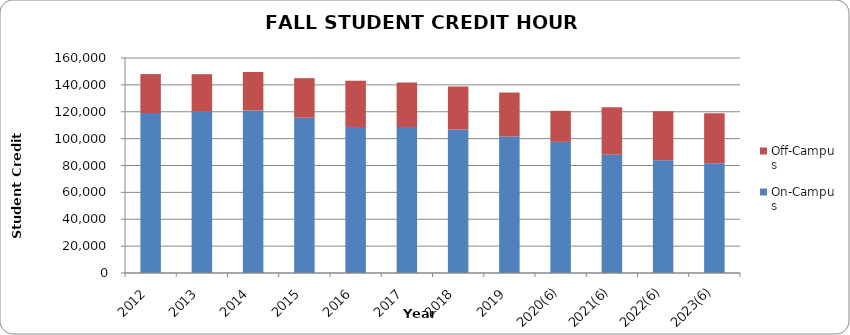
| Category | On-Campus | Off-Campus |
|---|---|---|
| 2012 | 119047 | 28972 |
| 2013 | 120113 | 27854 |
| 2014 | 120922 | 28672 |
| 2015 | 115555 | 29445 |
| 2016 | 108619 | 34509 |
| 2017 | 108606 | 33231 |
| 2018 | 106750 | 32097 |
| 2019 | 101574 | 32844 |
| 2020(6) | 97594 | 23109 |
| 2021(6) | 88013 | 35413 |
| 2022(6) | 83917 | 36447 |
| 2023(6) | 81609 | 37196 |